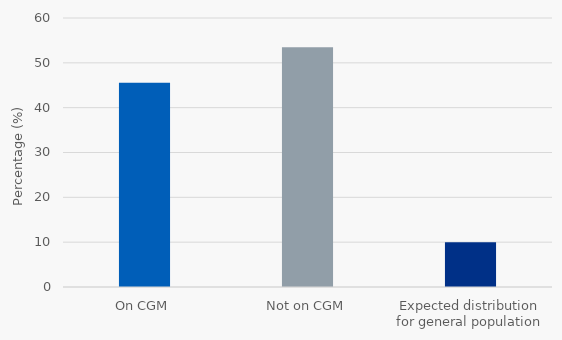
| Category | LGA |
|---|---|
| On CGM | 45.551 |
| Not on CGM | 53.474 |
| Expected distribution for general population | 10 |